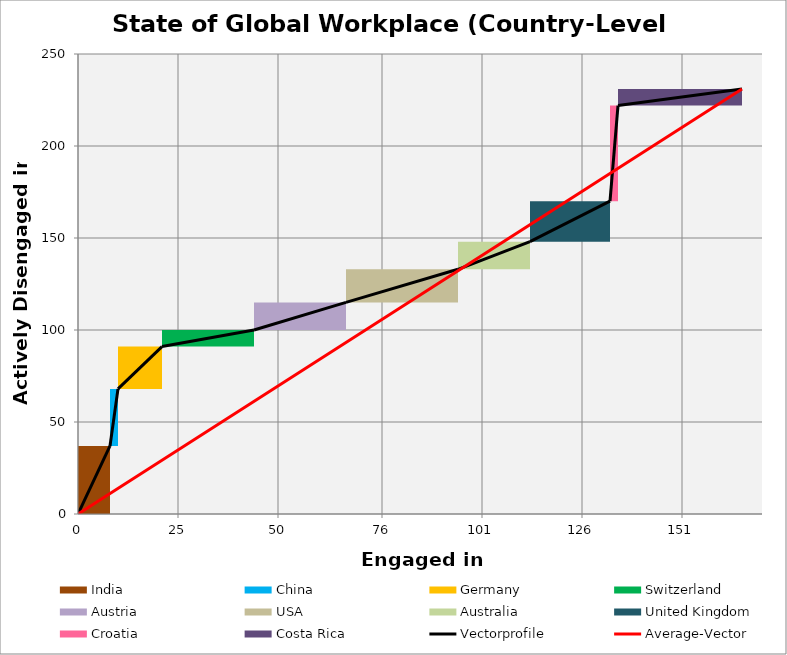
| Category | transparent | India | China | Germany | Switzerland | Austria | USA | Australia | United Kingdom | Croatia | Costa Rica | Border right & top |
|---|---|---|---|---|---|---|---|---|---|---|---|---|
| 0.0 | 0 | 37 | 0 | 0 | 0 | 0 | 0 | 0 | 0 | 0 | 0 | 0 |
| 8.0 | 0 | 37 | 0 | 0 | 0 | 0 | 0 | 0 | 0 | 0 | 0 | 0 |
| 8.0 | 37 | 0 | 31 | 0 | 0 | 0 | 0 | 0 | 0 | 0 | 0 | 0 |
| 10.0 | 37 | 0 | 31 | 0 | 0 | 0 | 0 | 0 | 0 | 0 | 0 | 0 |
| 10.0 | 68 | 0 | 0 | 23 | 0 | 0 | 0 | 0 | 0 | 0 | 0 | 0 |
| 21.0 | 68 | 0 | 0 | 23 | 0 | 0 | 0 | 0 | 0 | 0 | 0 | 0 |
| 21.0 | 91 | 0 | 0 | 0 | 9 | 0 | 0 | 0 | 0 | 0 | 0 | 0 |
| 44.0 | 91 | 0 | 0 | 0 | 9 | 0 | 0 | 0 | 0 | 0 | 0 | 0 |
| 44.0 | 100 | 0 | 0 | 0 | 0 | 15 | 0 | 0 | 0 | 0 | 0 | 0 |
| 67.0 | 100 | 0 | 0 | 0 | 0 | 15 | 0 | 0 | 0 | 0 | 0 | 0 |
| 67.0 | 115 | 0 | 0 | 0 | 0 | 0 | 18 | 0 | 0 | 0 | 0 | 0 |
| 95.0 | 115 | 0 | 0 | 0 | 0 | 0 | 18 | 0 | 0 | 0 | 0 | 0 |
| 95.0 | 133 | 0 | 0 | 0 | 0 | 0 | 0 | 15 | 0 | 0 | 0 | 0 |
| 113.0 | 133 | 0 | 0 | 0 | 0 | 0 | 0 | 15 | 0 | 0 | 0 | 0 |
| 113.0 | 148 | 0 | 0 | 0 | 0 | 0 | 0 | 0 | 22 | 0 | 0 | 0 |
| 133.0 | 148 | 0 | 0 | 0 | 0 | 0 | 0 | 0 | 22 | 0 | 0 | 0 |
| 133.0 | 170 | 0 | 0 | 0 | 0 | 0 | 0 | 0 | 0 | 52 | 0 | 0 |
| 135.0 | 170 | 0 | 0 | 0 | 0 | 0 | 0 | 0 | 0 | 52 | 0 | 0 |
| 135.0 | 222 | 0 | 0 | 0 | 0 | 0 | 0 | 0 | 0 | 0 | 9 | 0 |
| 166.0 | 222 | 0 | 0 | 0 | 0 | 0 | 0 | 0 | 0 | 0 | 9 | 0 |
| 166.0 | 231 | 0 | 0 | 0 | 0 | 0 | 0 | 0 | 0 | 0 | 0 | 0 |
| 171.0 | 231 | 0 | 0 | 0 | 0 | 0 | 0 | 0 | 0 | 0 | 0 | 0 |
| 171.0 | 231 | 0 | 0 | 0 | 0 | 0 | 0 | 0 | 0 | 0 | 0 | 0 |